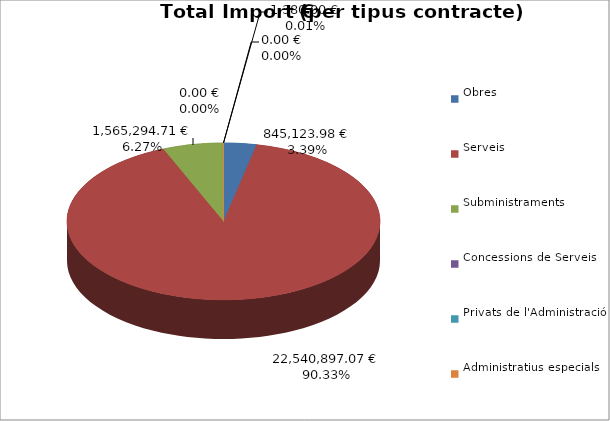
| Category | Total preu
(amb IVA) |
|---|---|
| Obres | 845123.98 |
| Serveis | 22540897.07 |
| Subministraments | 1565294.71 |
| Concessions de Serveis | 0 |
| Privats de l'Administració | 1380 |
| Administratius especials | 0 |